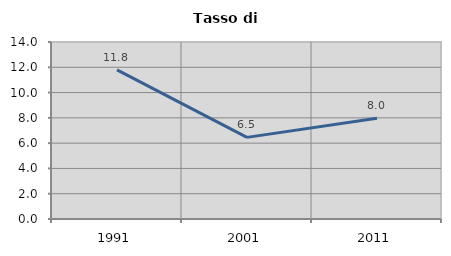
| Category | Tasso di disoccupazione   |
|---|---|
| 1991.0 | 11.792 |
| 2001.0 | 6.455 |
| 2011.0 | 7.967 |